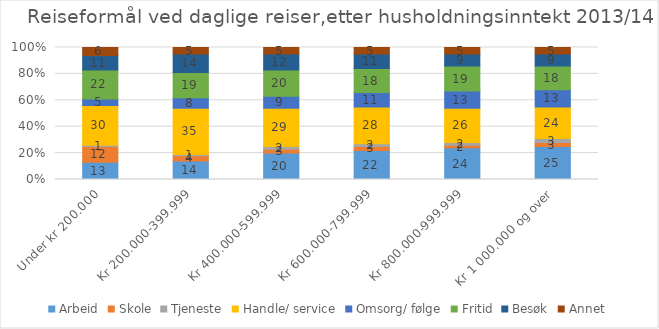
| Category | Arbeid | Skole | Tjeneste | Handle/ service | Omsorg/ følge | Fritid | Besøk | Annet |
|---|---|---|---|---|---|---|---|---|
| Under kr 200.000 | 13 | 12 | 1 | 30 | 5 | 22 | 11 | 6 |
| Kr 200.000-399.999 | 14 | 4 | 1 | 35 | 8 | 19 | 14 | 5 |
| Kr 400.000-599.999 | 20 | 3 | 2 | 29 | 9 | 20 | 12 | 5 |
| Kr 600.000-799.999 | 22 | 3 | 2 | 28 | 11 | 18 | 11 | 5 |
| Kr 800.000-999.999 | 24 | 2 | 2 | 26 | 13 | 19 | 9 | 5 |
| Kr 1 000.000 og over | 25 | 3 | 3 | 24 | 13 | 18 | 9 | 5 |